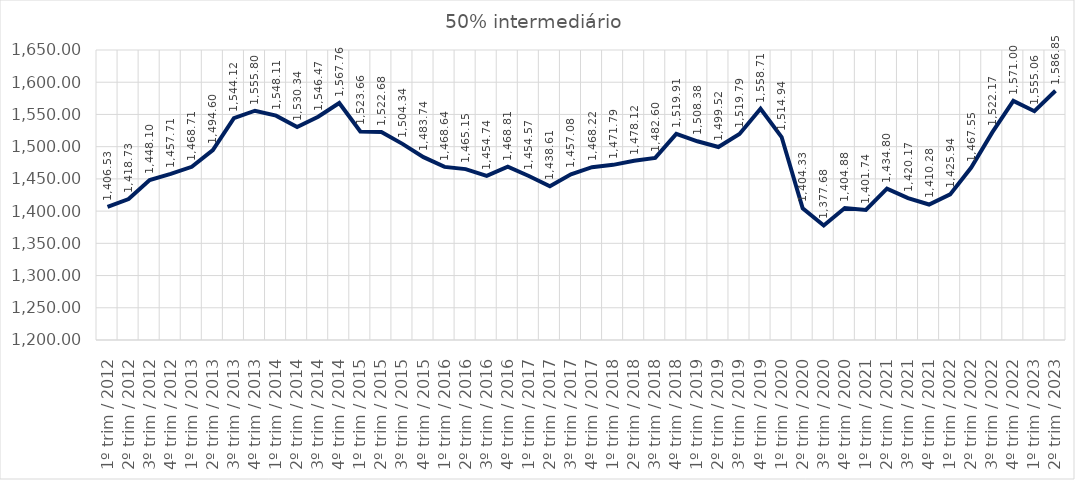
| Category | 50% intermediário |
|---|---|
| 1º trim / 2012 | 1406.529 |
| 2º trim / 2012 | 1418.733 |
| 3º trim / 2012 | 1448.102 |
| 4º trim / 2012 | 1457.71 |
| 1º trim / 2013 | 1468.706 |
| 2º trim / 2013 | 1494.603 |
| 3º trim / 2013 | 1544.124 |
| 4º trim / 2013 | 1555.799 |
| 1º trim / 2014 | 1548.111 |
| 2º trim / 2014 | 1530.342 |
| 3º trim / 2014 | 1546.465 |
| 4º trim / 2014 | 1567.756 |
| 1º trim / 2015 | 1523.658 |
| 2º trim / 2015 | 1522.676 |
| 3º trim / 2015 | 1504.335 |
| 4º trim / 2015 | 1483.736 |
| 1º trim / 2016 | 1468.643 |
| 2º trim / 2016 | 1465.149 |
| 3º trim / 2016 | 1454.736 |
| 4º trim / 2016 | 1468.808 |
| 1º trim / 2017 | 1454.57 |
| 2º trim / 2017 | 1438.613 |
| 3º trim / 2017 | 1457.075 |
| 4º trim / 2017 | 1468.224 |
| 1º trim / 2018 | 1471.788 |
| 2º trim / 2018 | 1478.123 |
| 3º trim / 2018 | 1482.604 |
| 4º trim / 2018 | 1519.909 |
| 1º trim / 2019 | 1508.382 |
| 2º trim / 2019 | 1499.517 |
| 3º trim / 2019 | 1519.788 |
| 4º trim / 2019 | 1558.707 |
| 1º trim / 2020 | 1514.942 |
| 2º trim / 2020 | 1404.329 |
| 3º trim / 2020 | 1377.678 |
| 4º trim / 2020 | 1404.882 |
| 1º trim / 2021 | 1401.744 |
| 2º trim / 2021 | 1434.797 |
| 3º trim / 2021 | 1420.165 |
| 4º trim / 2021 | 1410.28 |
| 1º trim / 2022 | 1425.94 |
| 2º trim / 2022 | 1467.553 |
| 3º trim / 2022 | 1522.166 |
| 4º trim / 2022 | 1570.999 |
| 1º trim / 2023 | 1555.06 |
| 2º trim / 2023 | 1586.845 |